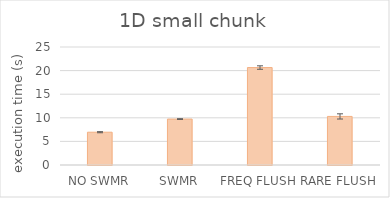
| Category | 1D small chunk |
|---|---|
| NO SWMR | 6.946 |
| SWMR | 9.731 |
| FREQ FLUSH | 20.647 |
| RARE FLUSH | 10.292 |